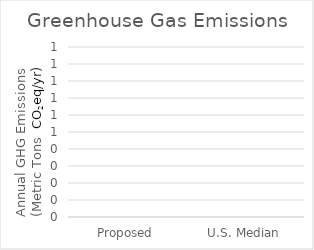
| Category | Metric Tons of Greenhouse Gas Emissions (MTCO2eq)e: |
|---|---|
| 0 | 0 |
| 1 | 0 |